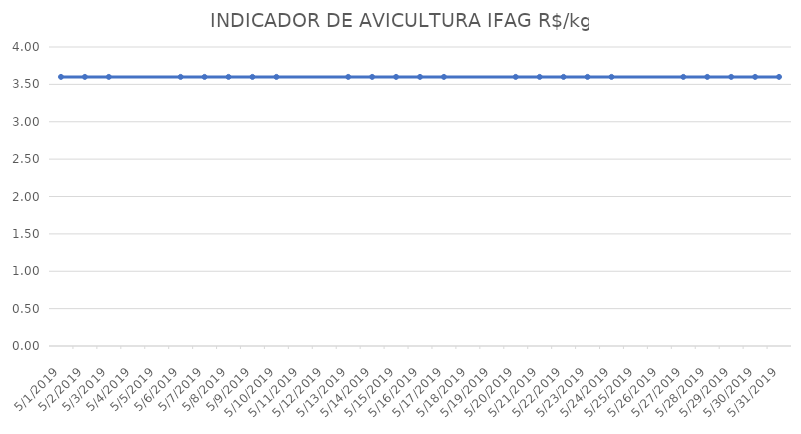
| Category | INDICADOR DE AVICULTURA IFAG |
|---|---|
| 5/1/19 | 3.6 |
| 5/2/19 | 3.6 |
| 5/3/19 | 3.6 |
| 5/6/19 | 3.6 |
| 5/7/19 | 3.6 |
| 5/8/19 | 3.6 |
| 5/9/19 | 3.6 |
| 5/10/19 | 3.6 |
| 5/13/19 | 3.6 |
| 5/14/19 | 3.6 |
| 5/15/19 | 3.6 |
| 5/16/19 | 3.6 |
| 5/17/19 | 3.6 |
| 5/20/19 | 3.6 |
| 5/21/19 | 3.6 |
| 5/22/19 | 3.6 |
| 5/23/19 | 3.6 |
| 5/24/19 | 3.6 |
| 5/27/19 | 3.6 |
| 5/28/19 | 3.6 |
| 5/29/19 | 3.6 |
| 5/30/19 | 3.6 |
| 5/31/19 | 3.6 |